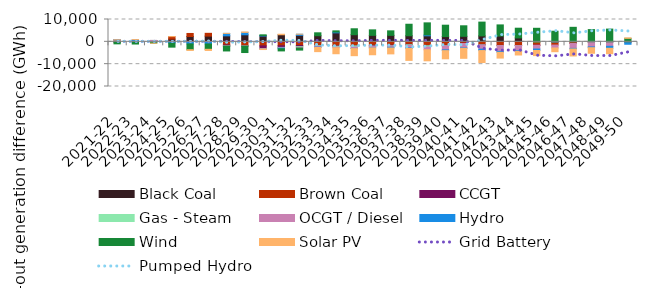
| Category | Black Coal | Brown Coal | CCGT | Gas - Steam | OCGT / Diesel | Hydro | Wind | Solar PV |
|---|---|---|---|---|---|---|---|---|
| 2021-22 | 44.065 | 844.324 | 0 | 1.849 | 1.999 | 14.87 | -903.409 | 0 |
| 2022-23 | 237.052 | 261.047 | 0 | 1.053 | 1.001 | 507.524 | -982.085 | 0.002 |
| 2023-24 | 210.089 | 386.266 | 16.039 | 1.331 | 3.086 | -315.381 | -289.103 | -5.708 |
| 2024-25 | 1235.697 | 1096.474 | -150.91 | -29.927 | -54.893 | -333.795 | -1807.041 | 0.001 |
| 2025-26 | 2393.783 | 1352.127 | -83.73 | -47.941 | -38.798 | -768.262 | -2590.989 | -320.903 |
| 2026-27 | 2570.828 | 1238.53 | -94.125 | -35.917 | -54.455 | -789.21 | -2371.173 | -516.765 |
| 2027-28 | 2679.147 | -1398.605 | -432.925 | -57.798 | -50.775 | 1098.277 | -2143.854 | 6.961 |
| 2028-29 | 3150.063 | -1763.714 | -97.413 | -44.442 | -51.521 | 1071.9 | -2833.395 | 193.388 |
| 2029-30 | 2603.275 | -1817.197 | -1224.289 | -93.045 | -147.207 | 249.781 | 280.082 | -168.816 |
| 2030-31 | 3168.028 | -1759.297 | -737.194 | -135.839 | -186.045 | -291.443 | -954.702 | 239.468 |
| 2031-32 | 2903.202 | -1645.771 | -505.31 | -307.16 | -336.938 | 497.205 | -901.896 | 2.806 |
| 2032-33 | 2747.331 | -1613.335 | -108.747 | -231.761 | -399.854 | -164.526 | 1294.319 | -1865.05 |
| 2033-34 | 4027.69 | -1725.996 | -244.96 | -375.994 | -322.945 | 351.867 | 536.469 | -2654.349 |
| 2034-35 | 3190.938 | -1683.622 | -123.886 | -510.208 | -635.614 | -67.783 | 2656.613 | -3174.33 |
| 2035-36 | 2901.243 | -1579.203 | -323.973 | -171.791 | -595.396 | -21.78 | 2460.107 | -3089.292 |
| 2036-37 | 2900.444 | -1500.772 | -293.876 | -81.425 | -562.029 | -298.468 | 2019.512 | -2656.769 |
| 2037-38 | 2726.03 | -1127.693 | -167.935 | -278.612 | -1126.231 | -232.252 | 5148.118 | -5377.163 |
| 2038-39 | 2691.686 | -1629.091 | -122.902 | -531.102 | -1258.25 | 433.19 | 5371.414 | -4951.989 |
| 2039-40 | 2353.971 | -1616.133 | -159.128 | -5.269 | -1811.108 | -353.167 | 5094.712 | -3657.629 |
| 2040-41 | 2469.053 | -648.732 | -97.66 | -7.559 | -1938.072 | -207.951 | 4712.926 | -4486.244 |
| 2041-42 | 2667.59 | -1257.301 | -149.504 | -5.082 | -1859.43 | -636.414 | 6164.091 | -5334.045 |
| 2042-43 | 2594.086 | -1609.25 | -71.75 | -6.993 | -2589.392 | -404.003 | 4985.013 | -2594.078 |
| 2043-44 | 1751.647 | -1698.009 | -5.097 | -2.528 | -2219.594 | -305.127 | 4351.395 | -1658.062 |
| 2044-45 | -4.68 | -1503.488 | -39.816 | 0.986 | -1681.645 | -643.574 | 6065.446 | -2290.095 |
| 2045-46 | 16.973 | -1456.476 | 2.904 | 1.256 | -1300.04 | 62.582 | 4669.392 | -1662.797 |
| 2046-47 | 25.508 | -687.92 | -0.001 | 0 | -2245.435 | -245.768 | 6473.857 | -3154.535 |
| 2047-48 | 51.632 | 0 | -0.001 | 0 | -2277.629 | -354.47 | 5424.504 | -2479.657 |
| 2048-49 | 18.117 | 0 | -0.001 | 0 | -2002.976 | -888.386 | 5683.65 | -2431.178 |
| 2049-50 | 29.758 | 0 | -0.001 | 0 | -389.454 | -696.792 | 1529.723 | 198.416 |